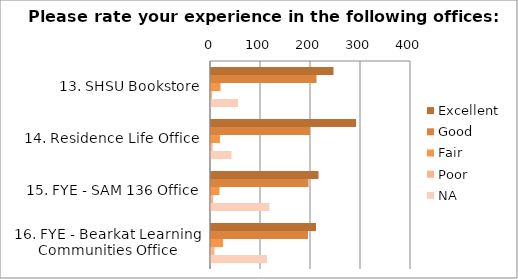
| Category | Excellent | Good | Fair | Poor | NA |
|---|---|---|---|---|---|
| 13. SHSU Bookstore | 245 | 211 | 19 | 2 | 54 |
| 14. Residence Life Office | 290 | 198 | 18 | 3 | 41 |
| 15. FYE - SAM 136 Office | 215 | 195 | 17 | 4 | 117 |
| 16. FYE - Bearkat Learning Communities Office | 210 | 194 | 24 | 7 | 112 |